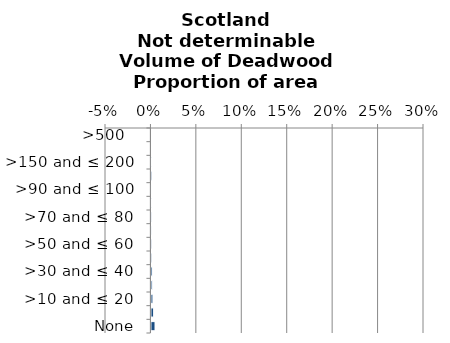
| Category | Not determinable |
|---|---|
|  None | 0.004 |
| >0 and ≤ 10 | 0.002 |
| >10 and ≤ 20  | 0.002 |
| >20 and ≤ 30  | 0.001 |
| >30 and ≤ 40  | 0.001 |
| >40 and ≤ 50  | 0 |
| >50 and ≤ 60  | 0 |
| >60 and ≤ 70  | 0 |
| >70 and ≤ 80  | 0 |
| >80 and ≤ 90  | 0 |
| >90 and ≤ 100  | 0 |
| >100 and ≤ 150 | 0.001 |
| >150 and ≤ 200  | 0 |
| >200 and ≤ 500 | 0 |
| >500   | 0 |